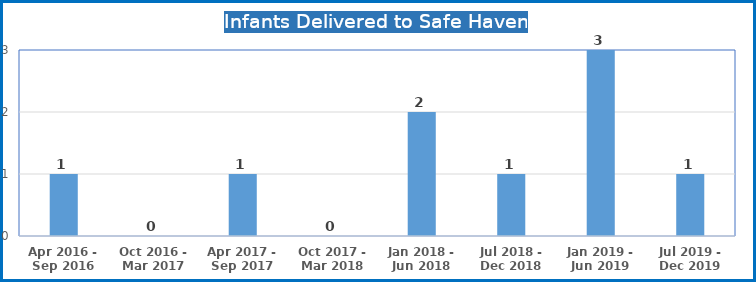
| Category | Infants Delivered to Safe Haven |
|---|---|
| Apr 2016 - Sep 2016 | 1 |
| Oct 2016 - Mar 2017 | 0 |
| Apr 2017 - Sep 2017 | 1 |
| Oct 2017 - Mar 2018 | 0 |
| Jan 2018 - Jun 2018 | 2 |
| Jul 2018 - Dec 2018 | 1 |
| Jan 2019 - Jun 2019 | 3 |
| Jul 2019 - Dec 2019 | 1 |